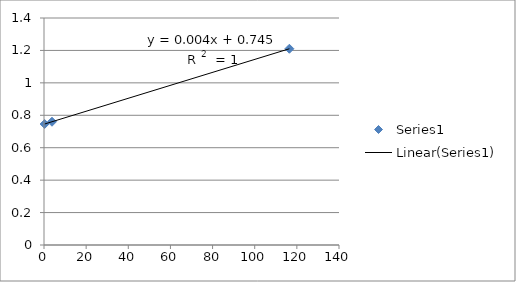
| Category | Series 0 |
|---|---|
| 0.2965 | 0.746 |
| 3.794 | 0.76 |
| 116.45 | 1.21 |